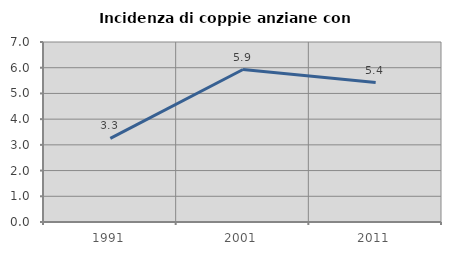
| Category | Incidenza di coppie anziane con figli |
|---|---|
| 1991.0 | 3.252 |
| 2001.0 | 5.93 |
| 2011.0 | 5.422 |